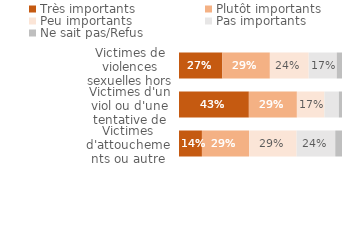
| Category | Très importants | Plutôt importants | Peu importants | Pas importants | Ne sait pas/Refus |
|---|---|---|---|---|---|
| Victimes d'attouchements ou autre agression sexuelle | 0.141 | 0.289 | 0.292 | 0.237 | 0.041 |
| Victimes d'un viol ou d'une tentative de viol  | 0.429 | 0.295 | 0.169 | 0.088 | 0.019 |
| Victimes de violences sexuelles hors ménage | 0.266 | 0.292 | 0.238 | 0.172 | 0.032 |